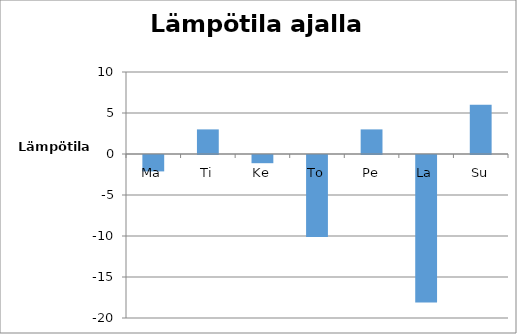
| Category | Lämpötila |
|---|---|
| Ma | -2 |
| Ti | 3 |
| Ke | -1 |
| To | -10 |
| Pe | 3 |
| La | -18 |
| Su | 6 |